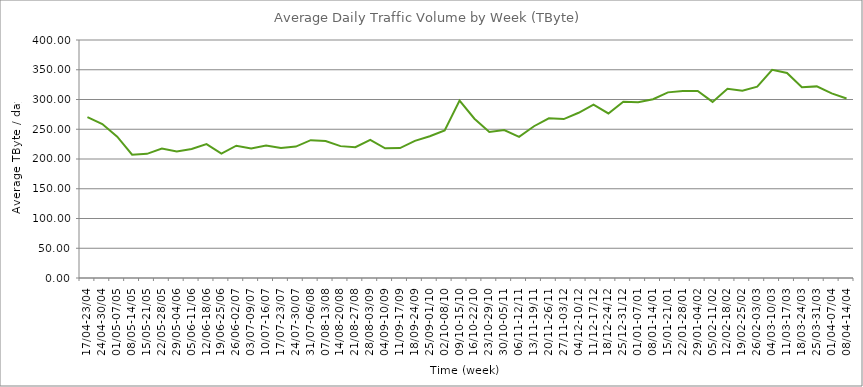
| Category | Average |
|---|---|
| 17/04-23/04 | 270.39 |
| 24/04-30/04 | 258.68 |
| 01/05-07/05 | 237.53 |
| 08/05-14/05 | 207.31 |
| 15/05-21/05 | 208.68 |
| 22/05-28/05 | 217.64 |
| 29/05-04/06 | 212.69 |
| 05/06-11/06 | 216.86 |
| 12/06-18/06 | 225.06 |
| 19/06-25/06 | 209.05 |
| 26/06-02/07 | 222.32 |
| 03/07-09/07 | 217.77 |
| 10/07-16/07 | 222.57 |
| 17/07-23/07 | 218.31 |
| 24/07-30/07 | 220.83 |
| 31/07-06/08 | 231.62 |
| 07/08-13/08 | 230.24 |
| 14/08-20/08 | 221.62 |
| 21/08-27/08 | 219.78 |
| 28/08-03/09 | 232.12 |
| 04/09-10/09 | 217.9 |
| 11/09-17/09 | 218.31 |
| 18/09-24/09 | 230.51 |
| 25/09-01/10 | 238.21 |
| 02/10-08/10 | 248.15 |
| 09/10-15/10 | 298.21 |
| 16/10-22/10 | 267.7 |
| 23/10-29/10 | 245.58 |
| 30/10-05/11 | 248.56 |
| 06/11-12/11 | 237.25 |
| 13/11-19/11 | 255.08 |
| 20/11-26/11 | 268.38 |
| 27/11-03/12 | 267.12 |
| 04/12-10/12 | 277.71 |
| 11/12-17/12 | 291.34 |
| 18/12-24/12 | 276.57 |
| 25/12-31/12 | 296.37 |
| 01/01-07/01 | 295.31 |
| 08/01-14/01 | 300.49 |
| 15/01-21/01 | 311.97 |
| 22/01-28/01 | 314.2 |
| 29/01-04/02 | 314.2 |
| 05/02-11/02 | 296 |
| 12/02-18/02 | 317.88 |
| 19/02-25/02 | 314.84 |
| 26/02-03/03 | 321.49 |
| 04/03-10/03 | 350.02 |
| 11/03-17/03 | 344.65 |
| 18/03-24/03 | 320.47 |
| 25/03-31/03 | 322.05 |
| 01/04-07/04 | 310.19 |
| 08/04-14/04 | 301.71 |